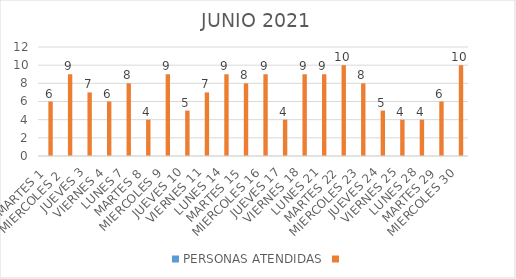
| Category | PERSONAS ATENDIDAS | Series 1 |
|---|---|---|
| MARTES 1 |  | 6 |
| MIERCOLES 2  |  | 9 |
| JUEVES 3 |  | 7 |
| VIERNES 4 |  | 6 |
| LUNES 7 |  | 8 |
| MARTES 8 |  | 4 |
| MIERCOLES 9 |  | 9 |
| JUEVES 10 |  | 5 |
| VIERNES 11 |  | 7 |
| LUNES 14 |  | 9 |
| MARTES 15 |  | 8 |
| MIERCOLES 16 |  | 9 |
| JUEVES 17 |  | 4 |
| VIERNES 18 |  | 9 |
| LUNES 21 |  | 9 |
| MARTES 22 |  | 10 |
| MIERCOLES 23 |  | 8 |
| JUEVES 24 |  | 5 |
| VIERNES 25 |  | 4 |
| LUNES 28 |  | 4 |
| MARTES 29 |  | 6 |
| MIERCOLES 30 |  | 10 |